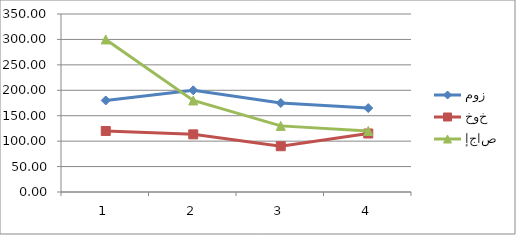
| Category | موز | خوخ | إجاص |
|---|---|---|---|
| 0 | 180 | 120 | 300 |
| 1 | 200 | 113.333 | 180 |
| 2 | 175 | 90 | 130 |
| 3 | 165 | 115 | 120 |